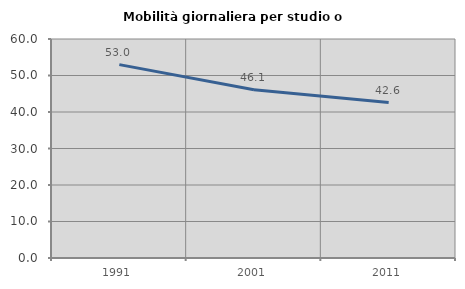
| Category | Mobilità giornaliera per studio o lavoro |
|---|---|
| 1991.0 | 52.984 |
| 2001.0 | 46.108 |
| 2011.0 | 42.593 |